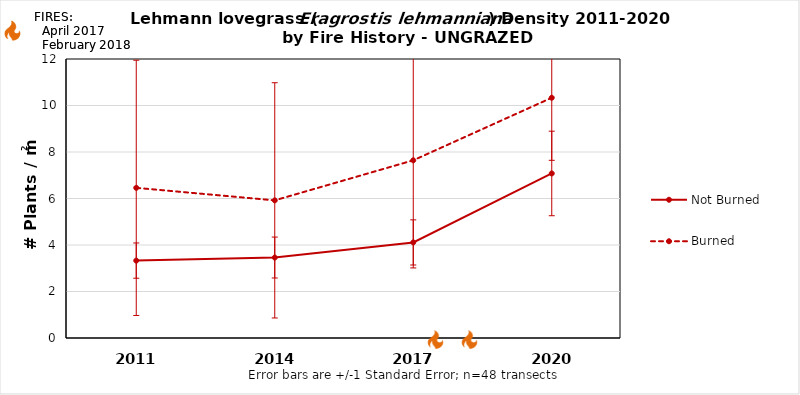
| Category | Not Burned | Burned |
|---|---|---|
| 2011.0 | 3.329 | 6.458 |
| 2014.0 | 3.461 | 5.92 |
| 2017.0 | 4.111 | 7.642 |
| 2020.0 | 7.077 | 10.333 |